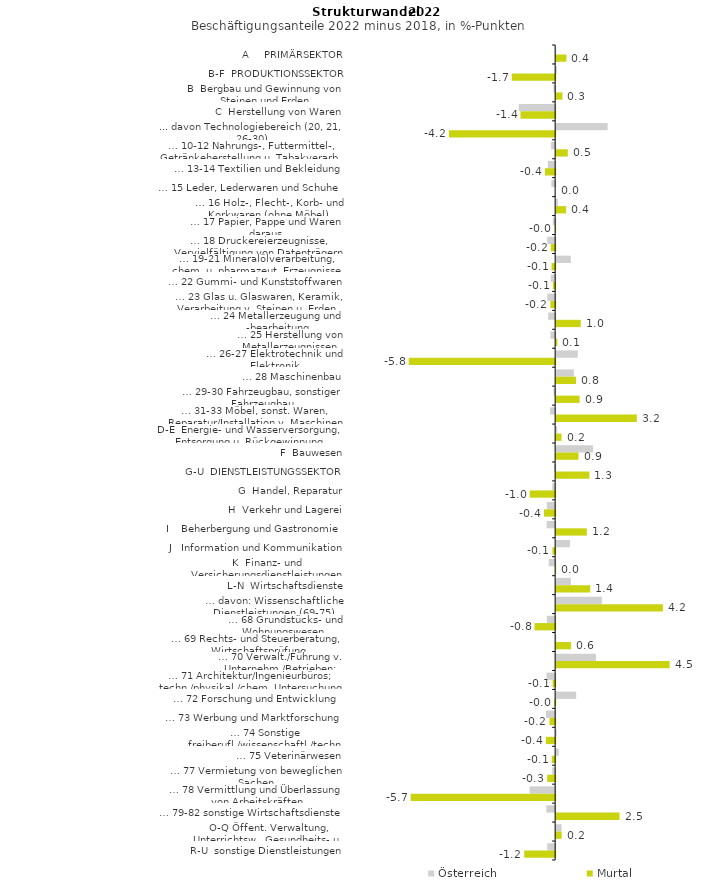
| Category | Österreich | Murtal |
|---|---|---|
| A     PRIMÄRSEKTOR | 0.004 | 0.41 |
| B-F  PRODUKTIONSSEKTOR | 0.036 | -1.725 |
| B  Bergbau und Gewinnung von Steinen und Erden | -0.063 | 0.251 |
| C  Herstellung von Waren | -1.445 | -1.378 |
| ... davon Technologiebereich (20, 21, 26-30) | 2.047 | -4.226 |
| … 10-12 Nahrungs-, Futtermittel-, Getränkeherstellung u. Tabakverarb. | -0.163 | 0.464 |
| … 13-14 Textilien und Bekleidung | -0.292 | -0.408 |
| … 15 Leder, Lederwaren und Schuhe | -0.15 | 0 |
| … 16 Holz-, Flecht-, Korb- und Korkwaren (ohne Möbel)  | 0.068 | 0.394 |
| … 17 Papier, Pappe und Waren daraus  | -0.09 | -0.011 |
| … 18 Druckereierzeugnisse, Vervielfältigung von Datenträgern | -0.314 | -0.173 |
| … 19-21 Mineralölverarbeitung, chem. u. pharmazeut. Erzeugnisse | 0.584 | -0.142 |
| … 22 Gummi- und Kunststoffwaren | -0.168 | -0.088 |
| … 23 Glas u. Glaswaren, Keramik, Verarbeitung v. Steinen u. Erden  | -0.312 | -0.189 |
| … 24 Metallerzeugung und -bearbeitung | -0.276 | 0.979 |
| … 25 Herstellung von Metallerzeugnissen  | -0.185 | 0.05 |
| … 26-27 Elektrotechnik und Elektronik | 0.862 | -5.824 |
| … 28 Maschinenbau | 0.705 | 0.794 |
| … 29-30 Fahrzeugbau, sonstiger Fahrzeugbau | -0.066 | 0.931 |
| … 31-33 Möbel, sonst. Waren, Reparatur/Installation v. Maschinen | -0.204 | 3.209 |
| D-E  Energie- und Wasserversorgung, Entsorgung u. Rückgewinnung | 0.038 | 0.215 |
| F  Bauwesen | 1.469 | 0.89 |
| G-U  DIENSTLEISTUNGSSEKTOR | -0.04 | 1.324 |
| G  Handel, Reparatur | -0.115 | -1.013 |
| H  Verkehr und Lagerei | -0.33 | -0.444 |
| I    Beherbergung und Gastronomie | -0.34 | 1.218 |
| J   Information und Kommunikation | 0.551 | -0.107 |
| K  Finanz- und Versicherungsdienstleistungen | -0.255 | 0.001 |
| L-N  Wirtschaftsdienste | 0.586 | 1.355 |
| … davon: Wissenschaftliche Dienstleistungen (69-75) | 1.815 | 4.245 |
| … 68 Grundstücks- und Wohnungswesen  | -0.331 | -0.821 |
| … 69 Rechts- und Steuerberatung, Wirtschaftsprüfung | 0.008 | 0.594 |
| … 70 Verwalt./Führung v. Unternehm./Betrieben; Unternehmensberat. | 1.583 | 4.514 |
| … 71 Architektur/Ingenieurbüros; techn./physikal./chem. Untersuchung | -0.344 | -0.101 |
| … 72 Forschung und Entwicklung  | 0.797 | -0.032 |
| … 73 Werbung und Marktforschung | -0.361 | -0.225 |
| … 74 Sonstige freiberufl./wissenschaftl./techn. Tätigkeiten | 0.025 | -0.37 |
| … 75 Veterinärwesen | 0.108 | -0.135 |
| … 77 Vermietung von beweglichen Sachen  | -0.116 | -0.316 |
| … 78 Vermittlung und Überlassung von Arbeitskräften | -1.018 | -5.748 |
| … 79-82 sonstige Wirtschaftsdienste | -0.351 | 2.522 |
| O-Q Öffent. Verwaltung, Unterrichtsw., Gesundheits- u. Sozialwesen | 0.216 | 0.22 |
| R-U  sonstige Dienstleistungen | -0.314 | -1.23 |